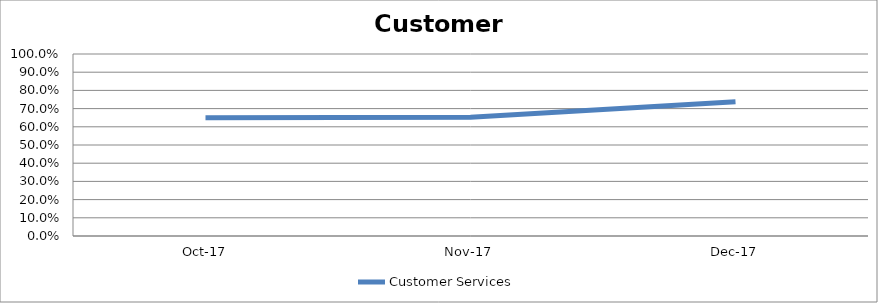
| Category | Customer Services |
|---|---|
| 2017-10-01 | 0.649 |
| 2017-11-01 | 0.652 |
| 2017-12-01 | 0.738 |